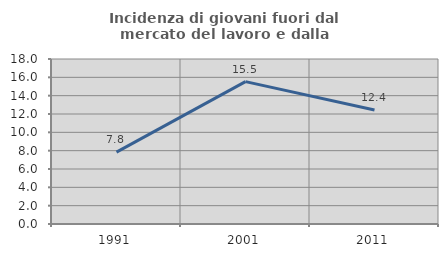
| Category | Incidenza di giovani fuori dal mercato del lavoro e dalla formazione  |
|---|---|
| 1991.0 | 7.837 |
| 2001.0 | 15.53 |
| 2011.0 | 12.442 |